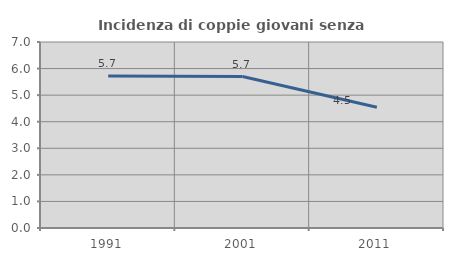
| Category | Incidenza di coppie giovani senza figli |
|---|---|
| 1991.0 | 5.725 |
| 2001.0 | 5.701 |
| 2011.0 | 4.547 |